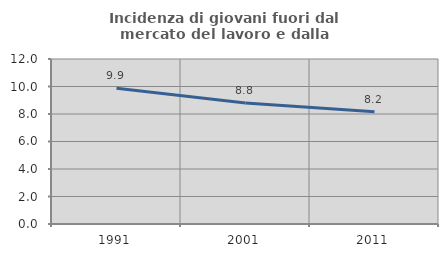
| Category | Incidenza di giovani fuori dal mercato del lavoro e dalla formazione  |
|---|---|
| 1991.0 | 9.868 |
| 2001.0 | 8.805 |
| 2011.0 | 8.159 |